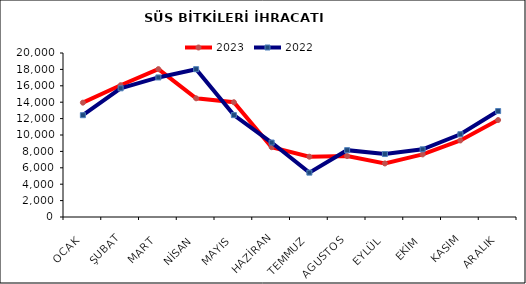
| Category | 2023 | 2022 |
|---|---|---|
| OCAK | 13942.906 | 12415.091 |
| ŞUBAT | 16068.542 | 15693.365 |
| MART | 18032.5 | 17018.631 |
| NİSAN | 14477.682 | 18025.693 |
| MAYIS | 13997.557 | 12424.482 |
| HAZİRAN | 8514.992 | 9079.773 |
| TEMMUZ | 7353.585 | 5411.485 |
| AGUSTOS | 7429.082 | 8150.752 |
| EYLÜL | 6531.478 | 7678.155 |
| EKİM | 7631.676 | 8254.692 |
| KASIM | 9334.027 | 10091.905 |
| ARALIK | 11825.378 | 12919.242 |